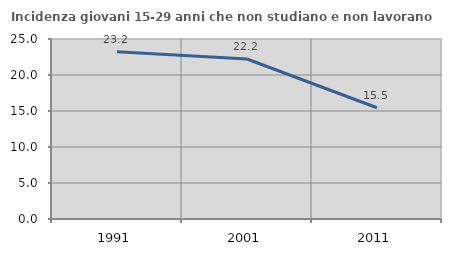
| Category | Incidenza giovani 15-29 anni che non studiano e non lavorano  |
|---|---|
| 1991.0 | 23.214 |
| 2001.0 | 22.222 |
| 2011.0 | 15.451 |